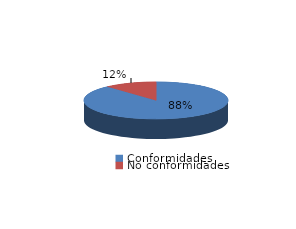
| Category | Series 0 |
|---|---|
| Conformidades | 1529 |
| No conformidades | 204 |